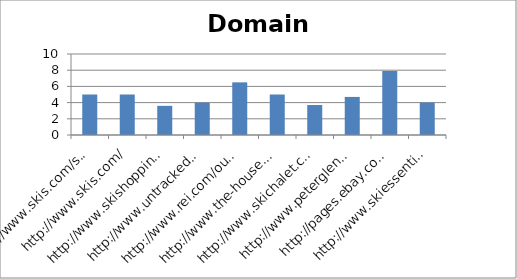
| Category | Domain mozRank |
|---|---|
| http://www.skis.com/ski-equipment/c9/ | 5 |
| http://www.skis.com/ | 5 |
| http://www.skishoppingguide.com/ | 3.6 |
| http://www.untracked.com/ | 4 |
| http://www.rei.com/outlet/category/22000078 | 6.5 |
| http://www.the-house.com/skis.html | 5 |
| http://www.skichalet.com/ | 3.7 |
| http://www.peterglenn.com/ | 4.7 |
| http://pages.ebay.com/buy/guides/skis-skiing-equipment-buying-guide/ | 7.9 |
| http://www.skiessentials.com/ | 4 |